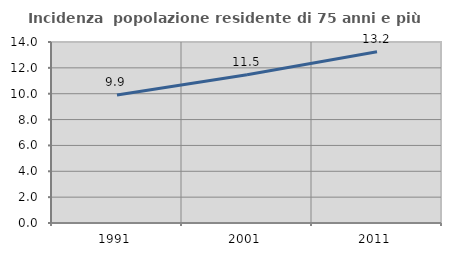
| Category | Incidenza  popolazione residente di 75 anni e più |
|---|---|
| 1991.0 | 9.905 |
| 2001.0 | 11.468 |
| 2011.0 | 13.244 |